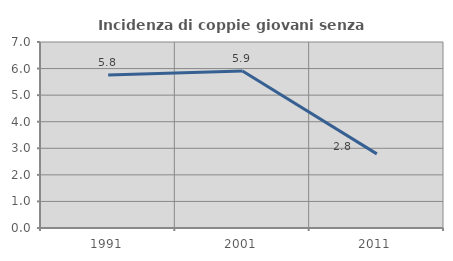
| Category | Incidenza di coppie giovani senza figli |
|---|---|
| 1991.0 | 5.761 |
| 2001.0 | 5.906 |
| 2011.0 | 2.789 |